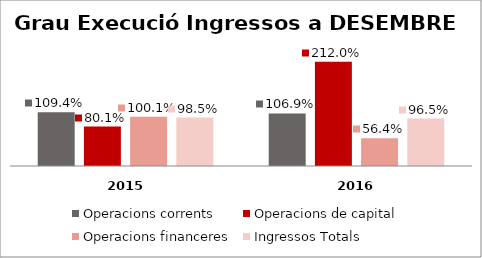
| Category | Operacions corrents | Operacions de capital | Operacions financeres | Ingressos Totals |
|---|---|---|---|---|
| 0 | 1.094 | 0.801 | 1.001 | 0.985 |
| 1 | 1.069 | 2.12 | 0.564 | 0.965 |